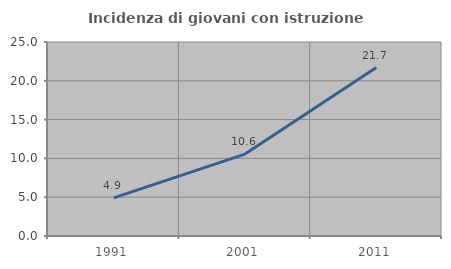
| Category | Incidenza di giovani con istruzione universitaria |
|---|---|
| 1991.0 | 4.923 |
| 2001.0 | 10.558 |
| 2011.0 | 21.705 |